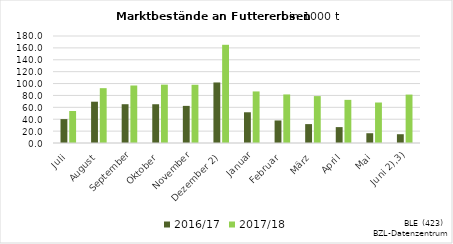
| Category | 2016/17 | 2017/18 |
|---|---|---|
| Juli | 40.21 | 53.859 |
| August | 69.475 | 92.247 |
| September | 65.245 | 96.72 |
| Oktober | 65.199 | 98.163 |
| November | 62.444 | 97.954 |
|  Dezember 2) | 101.833 | 165.221 |
| Januar | 51.698 | 86.735 |
| Februar | 37.913 | 81.682 |
| März | 31.787 | 78.905 |
| April | 26.729 | 72.57 |
| Mai | 16.435 | 68.111 |
|    Juni 2),3) | 14.778 | 81.438 |